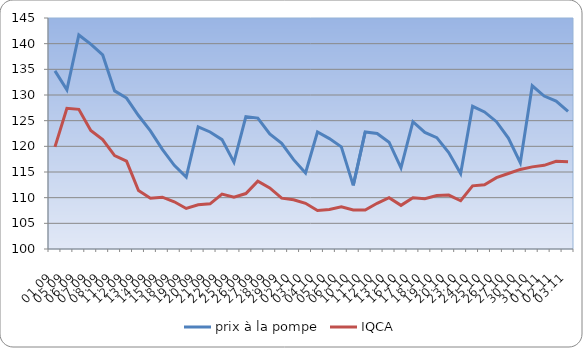
| Category | prix à la pompe | IQCA |
|---|---|---|
| 01.09 | 134.7 | 119.9 |
| 05.09 | 131 | 127.4 |
| 06.09 | 141.7 | 127.2 |
| 07.09 | 139.9 | 123.1 |
| 08.09 | 137.8 | 121.3 |
| 11.09 | 130.8 | 118.2 |
| 12.09 | 129.4 | 117.1 |
| 13.09 | 126 | 111.4 |
| 14.09 | 123 | 109.9 |
| 15.09 | 119.4 | 110.1 |
| 18.09 | 116.3 | 109.2 |
| 19.09 | 114 | 107.9 |
| 20.09 | 123.8 | 108.6 |
| 21.09 | 122.8 | 108.8 |
| 22.09 | 121.3 | 110.7 |
| 25.09 | 116.9 | 110.1 |
| 26.09 | 125.8 | 110.8 |
| 27.09 | 125.5 | 113.2 |
| 28.09 | 122.4 | 111.9 |
| 29.09 | 120.6 | 109.9 |
| 02.10 | 117.4 | 109.6 |
| 03.10 | 114.8 | 108.9 |
| 04.10 | 122.8 | 107.5 |
| 05.10 | 121.5 | 107.7 |
| 06.10 | 119.9 | 108.2 |
| 10.10 | 112.4 | 107.6 |
| 11.10 | 122.8 | 107.6 |
| 12.10 | 122.5 | 108.9 |
| 13.10 | 120.8 | 110 |
| 16.10 | 115.8 | 108.5 |
| 17.10 | 124.8 | 110 |
| 18.10 | 122.7 | 109.8 |
| 19.10 | 121.7 | 110.4 |
| 20.10 | 118.8 | 110.5 |
| 23.10 | 114.7 | 109.4 |
| 24.10 | 127.8 | 112.3 |
| 25.10 | 126.7 | 112.5 |
| 26.10 | 124.8 | 113.9 |
| 27.10 | 121.6 | 114.7 |
| 30.10 | 116.8 | 115.5 |
| 31.10 | 131.8 | 116 |
| 01.11 | 129.8 | 116.3 |
| 02.11 | 128.8 | 117.1 |
| 03.11 | 126.8 | 117 |